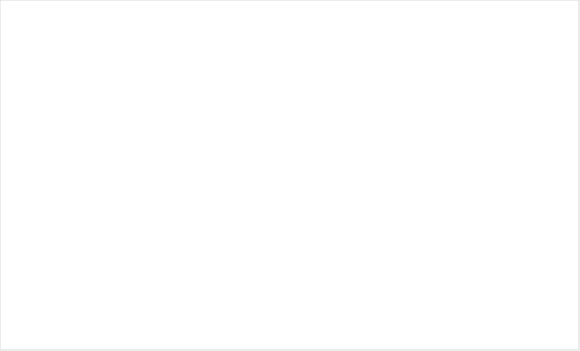
| Category | Итог |
|---|---|
| Не доводилось звертатися | 11 |
| Так | 5 |